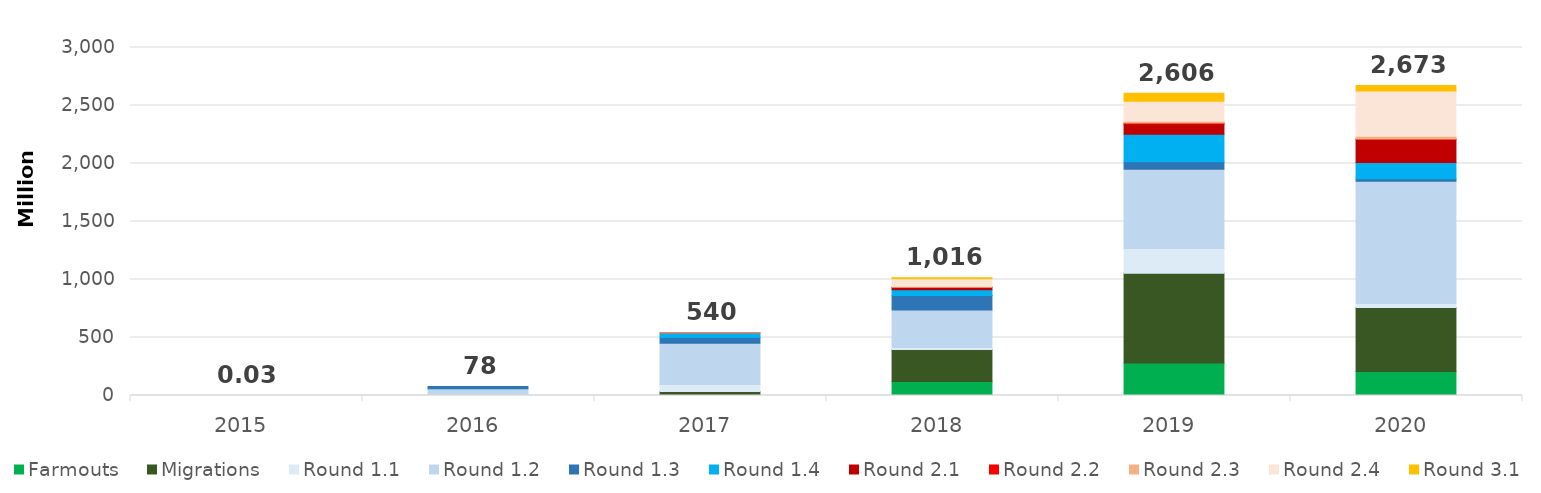
| Category | Farmouts | Migrations | Round 1.1 | Round 1.2 | Round 1.3 | Round 1.4 | Round 2.1 | Round 2.2 | Round 2.3 | Round 2.4 | Round 3.1 |
|---|---|---|---|---|---|---|---|---|---|---|---|
| 2015.0 | 0 | 0 | 0.023 | 0.003 | 0 | 0 | 0 | 0 | 0 | 0 | 0 |
| 2016.0 | 0 | 0 | 7.936 | 50.902 | 19.085 | 0 | 0 | 0 | 0 | 0 | 0 |
| 2017.0 | 1.551 | 32.93 | 60.276 | 356.292 | 49.073 | 38.707 | 0.93 | 0 | 0.096 | 0 | 0 |
| 2018.0 | 121.371 | 276.221 | 16.154 | 323.201 | 126.084 | 47.616 | 21.584 | 0.843 | 6.737 | 66.16 | 9.669 |
| 2019.0 | 280.617 | 772.208 | 213.486 | 685.106 | 64.331 | 235.595 | 88.72 | 9.392 | 14.554 | 173.042 | 69.349 |
| 2020.0 | 207.71 | 550.505 | 33.998 | 1054.149 | 22.253 | 140.295 | 198.226 | 3.04 | 23.885 | 391.695 | 46.857 |